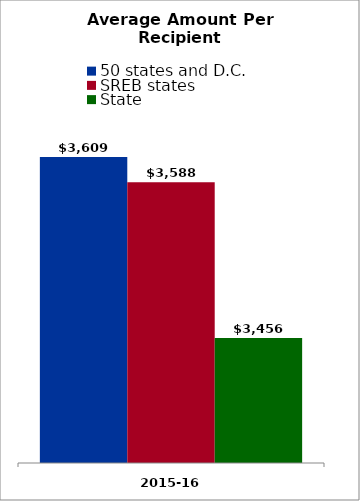
| Category | 50 states and D.C. | SREB states | State |
|---|---|---|---|
| 2015-16 | 3609.361 | 3587.926 | 3455.984 |